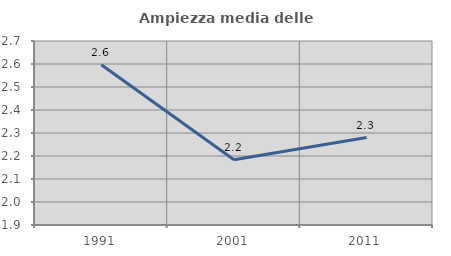
| Category | Ampiezza media delle famiglie |
|---|---|
| 1991.0 | 2.597 |
| 2001.0 | 2.183 |
| 2011.0 | 2.28 |